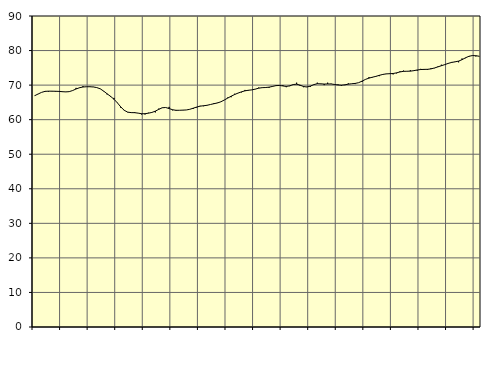
| Category | Piggar | Series 1 |
|---|---|---|
| nan | 67 | 66.94 |
| 87.0 | 67.4 | 67.44 |
| 87.0 | 67.9 | 67.9 |
| 87.0 | 68.3 | 68.19 |
| nan | 68.1 | 68.25 |
| 88.0 | 68.3 | 68.24 |
| 88.0 | 68.1 | 68.22 |
| 88.0 | 68.1 | 68.18 |
| nan | 68 | 68.1 |
| 89.0 | 68 | 68.04 |
| 89.0 | 68.1 | 68.11 |
| 89.0 | 68.4 | 68.43 |
| nan | 69.2 | 68.88 |
| 90.0 | 69.3 | 69.24 |
| 90.0 | 69.7 | 69.45 |
| 90.0 | 69.5 | 69.53 |
| nan | 69.6 | 69.53 |
| 91.0 | 69.5 | 69.46 |
| 91.0 | 69.3 | 69.29 |
| 91.0 | 68.9 | 68.93 |
| nan | 68.2 | 68.27 |
| 92.0 | 67.3 | 67.49 |
| 92.0 | 66.6 | 66.75 |
| 92.0 | 66.3 | 65.91 |
| nan | 64.9 | 64.85 |
| 93.0 | 63.4 | 63.65 |
| 93.0 | 62.8 | 62.69 |
| 93.0 | 62.1 | 62.17 |
| nan | 62.1 | 62.04 |
| 94.0 | 62.2 | 62.02 |
| 94.0 | 61.9 | 61.89 |
| 94.0 | 61.5 | 61.72 |
| nan | 61.5 | 61.72 |
| 95.0 | 62 | 61.88 |
| 95.0 | 62.1 | 62.09 |
| 95.0 | 62.1 | 62.47 |
| nan | 63.2 | 62.99 |
| 96.0 | 63.5 | 63.44 |
| 96.0 | 63.5 | 63.52 |
| 96.0 | 63.7 | 63.22 |
| nan | 62.7 | 62.87 |
| 97.0 | 62.8 | 62.71 |
| 97.0 | 62.7 | 62.72 |
| 97.0 | 62.8 | 62.76 |
| nan | 62.8 | 62.81 |
| 98.0 | 63 | 63 |
| 98.0 | 63.1 | 63.32 |
| 98.0 | 63.5 | 63.65 |
| nan | 64 | 63.91 |
| 99.0 | 63.9 | 64.03 |
| 99.0 | 64.2 | 64.16 |
| 99.0 | 64.4 | 64.39 |
| nan | 64.8 | 64.62 |
| 0.0 | 64.9 | 64.83 |
| 0.0 | 65.2 | 65.17 |
| 0.0 | 65.7 | 65.68 |
| nan | 66.4 | 66.24 |
| 1.0 | 66.5 | 66.79 |
| 1.0 | 67.5 | 67.27 |
| 1.0 | 67.7 | 67.69 |
| nan | 67.9 | 68.05 |
| 2.0 | 68.6 | 68.34 |
| 2.0 | 68.4 | 68.51 |
| 2.0 | 68.6 | 68.62 |
| nan | 68.8 | 68.84 |
| 3.0 | 69.3 | 69.11 |
| 3.0 | 69.3 | 69.26 |
| 3.0 | 69.2 | 69.3 |
| nan | 69.2 | 69.41 |
| 4.0 | 69.7 | 69.62 |
| 4.0 | 69.9 | 69.85 |
| 4.0 | 70 | 69.91 |
| nan | 70 | 69.76 |
| 5.0 | 69.4 | 69.62 |
| 5.0 | 69.7 | 69.79 |
| 5.0 | 70.2 | 70.16 |
| nan | 70.7 | 70.27 |
| 6.0 | 69.8 | 69.99 |
| 6.0 | 69.4 | 69.59 |
| 6.0 | 69.5 | 69.45 |
| nan | 69.5 | 69.71 |
| 7.0 | 70.2 | 70.15 |
| 7.0 | 70.7 | 70.4 |
| 7.0 | 70.3 | 70.37 |
| nan | 70 | 70.3 |
| 8.0 | 70.7 | 70.33 |
| 8.0 | 70.4 | 70.33 |
| 8.0 | 70.1 | 70.19 |
| nan | 70.2 | 70.04 |
| 9.0 | 69.8 | 69.98 |
| 9.0 | 70 | 70.09 |
| 9.0 | 70.5 | 70.27 |
| nan | 70.4 | 70.4 |
| 10.0 | 70.3 | 70.49 |
| 10.0 | 70.7 | 70.71 |
| 10.0 | 70.9 | 71.16 |
| nan | 71.7 | 71.66 |
| 11.0 | 72.3 | 72.03 |
| 11.0 | 72.2 | 72.29 |
| 11.0 | 72.6 | 72.53 |
| nan | 72.6 | 72.83 |
| 12.0 | 73 | 73.09 |
| 12.0 | 73.2 | 73.25 |
| 12.0 | 73.4 | 73.3 |
| nan | 73.1 | 73.36 |
| 13.0 | 73.4 | 73.55 |
| 13.0 | 74 | 73.82 |
| 13.0 | 74.2 | 73.98 |
| nan | 74 | 74.01 |
| 14.0 | 74.3 | 74.04 |
| 14.0 | 74.1 | 74.18 |
| 14.0 | 74.2 | 74.38 |
| nan | 74.7 | 74.51 |
| 15.0 | 74.4 | 74.55 |
| 15.0 | 74.4 | 74.57 |
| 15.0 | 74.9 | 74.7 |
| nan | 74.9 | 74.96 |
| 16.0 | 75.4 | 75.28 |
| 16.0 | 75.9 | 75.61 |
| 16.0 | 75.9 | 75.93 |
| nan | 76.2 | 76.29 |
| 17.0 | 76.7 | 76.57 |
| 17.0 | 76.8 | 76.74 |
| 17.0 | 76.6 | 76.95 |
| nan | 77.7 | 77.36 |
| 18.0 | 77.8 | 77.9 |
| 18.0 | 78.2 | 78.34 |
| 18.0 | 78.6 | 78.55 |
| nan | 78.3 | 78.51 |
| 19.0 | 78.3 | 78.35 |